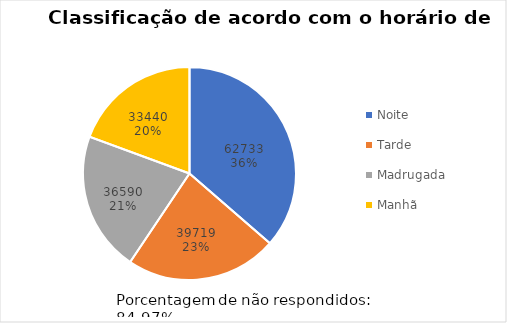
| Category | Series 0 |
|---|---|
| Noite | 62733 |
| Tarde | 39719 |
| Madrugada | 36590 |
| Manhã | 33440 |